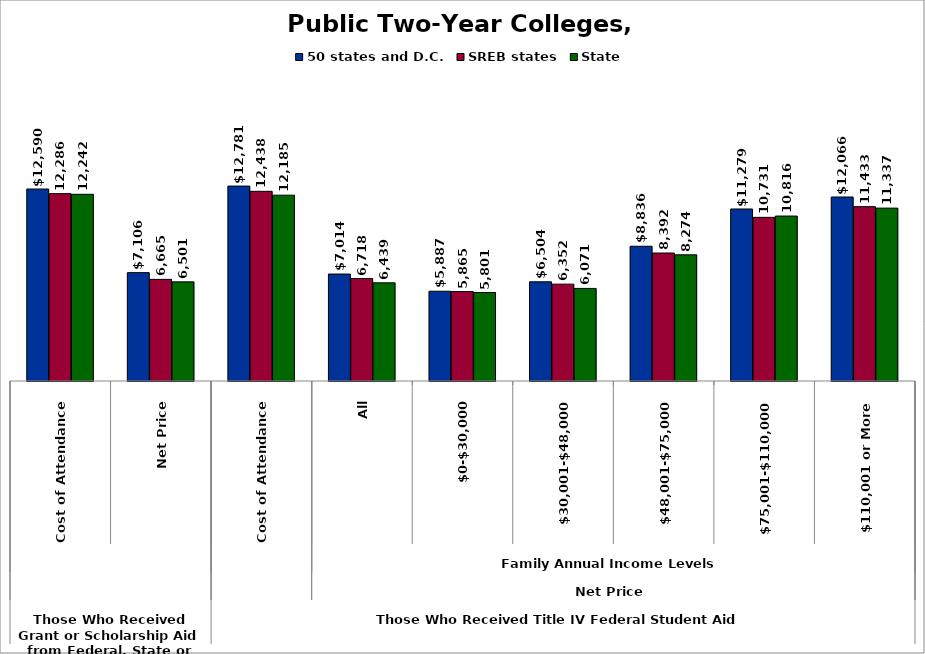
| Category | 50 states and D.C. | SREB states | State |
|---|---|---|---|
| 0 | 12589.805 | 12286.377 | 12242.415 |
| 1 | 7105.991 | 6664.823 | 6500.762 |
| 2 | 12781.317 | 12437.606 | 12185.419 |
| 3 | 7014.242 | 6718.369 | 6438.908 |
| 4 | 5886.935 | 5865.343 | 5801.486 |
| 5 | 6504.124 | 6352.387 | 6070.843 |
| 6 | 8835.797 | 8392.011 | 8274.282 |
| 7 | 11279.479 | 10731.296 | 10815.652 |
| 8 | 12065.766 | 11433.25 | 11336.828 |